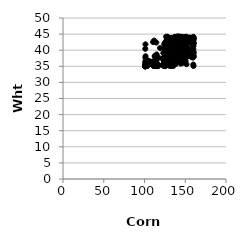
| Category | Series 0 |
|---|---|
| 136.72777560908997 | 35.765 |
| 130.25405878217626 | 36.356 |
| 138.38169360817292 | 40.525 |
| 147.95466621825304 | 41.478 |
| 157.93652203945828 | 42.384 |
| 145.1142160764156 | 37.748 |
| 102.15362811644198 | 35.946 |
| 127.79622655462948 | 42.979 |
| 159.40141447130028 | 42.681 |
| 139.8572153171643 | 42.993 |
| 140.04410825100643 | 41.652 |
| 125.28839167046857 | 40.023 |
| 154.35502141300222 | 43.609 |
| 101.50018633640991 | 35.24 |
| 126.73089541599688 | 39.45 |
| 133.78302110138736 | 38.708 |
| 100.81534180641341 | 35.036 |
| 135.9106538261241 | 42.587 |
| 144.70163184472543 | 41.023 |
| 137.67380770594968 | 42.192 |
| 125.8161522658447 | 37.862 |
| 144.47358134687306 | 42.185 |
| 101.28371883580245 | 38.121 |
| 116.55865361353845 | 35.044 |
| 150.19531930577875 | 38.073 |
| 127.9652267120658 | 42.442 |
| 132.53426273231733 | 41.588 |
| 132.25624815754523 | 36.519 |
| 147.7332097175809 | 37.868 |
| 134.77266203290574 | 40.825 |
| 130.50245933845278 | 38.812 |
| 128.92963068216812 | 36.381 |
| 128.07707935208498 | 43.072 |
| 159.48881929468297 | 37.696 |
| 101.25255429634939 | 35.365 |
| 102.60515078731365 | 35.361 |
| 152.03792089943082 | 40.462 |
| 147.36515889946048 | 41.777 |
| 132.33229366168916 | 41.93 |
| 123.28457222858277 | 35.102 |
| 160.3874768311301 | 38.092 |
| 100.71342991222684 | 35.007 |
| 137.7502930527938 | 41.564 |
| 111.45653751353935 | 35.074 |
| 133.23792423907062 | 42.244 |
| 124.28939290886308 | 41.845 |
| 150.37475608348595 | 36.664 |
| 145.82940093065787 | 38.461 |
| 134.61403264303803 | 43.092 |
| 102.78140307507637 | 35.804 |
| 147.80649185456153 | 39.119 |
| 135.07020181585025 | 43.51 |
| 134.94941046811618 | 36.562 |
| 127.94194534569507 | 42.789 |
| 105.71737378688425 | 36.649 |
| 150.35580454033305 | 43.659 |
| 151.16893175716208 | 42.697 |
| 142.37378215201423 | 43.584 |
| 149.49649763692324 | 36.777 |
| 134.2863159495147 | 42.075 |
| 139.28961793121934 | 39.021 |
| 136.24550839912322 | 38.605 |
| 133.08947951596048 | 43.722 |
| 153.78992681641517 | 40.324 |
| 160.0875590081285 | 41.274 |
| 149.54992638110843 | 38.553 |
| 148.02626354366294 | 43.538 |
| 141.4202918124553 | 40.097 |
| 151.8277004785291 | 38.894 |
| 140.81856470674865 | 38.943 |
| 130.8034514433382 | 39.058 |
| 135.4874719952224 | 42.487 |
| 133.58334572011807 | 37.039 |
| 139.24318246746913 | 38.708 |
| 142.11472846057399 | 41.66 |
| 115.02285806673206 | 35.075 |
| 127.75033827182104 | 38.354 |
| 101.16738249184034 | 41.82 |
| 124.707117973276 | 42.126 |
| 113.29790006227597 | 38.222 |
| 135.85412379999866 | 42.029 |
| 150.9299808003734 | 43.623 |
| 128.14687129542176 | 42.508 |
| 134.17156031287078 | 42.072 |
| 150.0737167668923 | 42.519 |
| 139.379389662458 | 39.047 |
| 131.414594250678 | 37.931 |
| 129.06022883741545 | 43.316 |
| 127.39636146210849 | 37.21 |
| 159.99789712811204 | 43.65 |
| 150.6932941827846 | 40.541 |
| 127.20123820496103 | 41.742 |
| 139.78921634008884 | 43.959 |
| 150.72189384811423 | 38.707 |
| 142.23229969795852 | 44.135 |
| 131.46871683967078 | 43.426 |
| 149.9092281695046 | 36.614 |
| 133.89787231306406 | 43.502 |
| 135.79133216996703 | 42.62 |
| 129.96167330858876 | 38.783 |
| 151.93471986193705 | 42.464 |
| 141.930859695245 | 41.702 |
| 140.2839199443765 | 40.041 |
| 128.24707921056554 | 37.813 |
| 140.3680052826824 | 42.674 |
| 134.0116940751758 | 37.562 |
| 154.97183677798196 | 39.298 |
| 112.21171621740429 | 35.798 |
| 131.8054861013131 | 39.649 |
| 126.56712252140473 | 42.785 |
| 138.01859751937292 | 42.994 |
| 112.67216486692249 | 35.905 |
| 137.7942676853786 | 38.16 |
| 157.35942402765727 | 42.356 |
| 137.3894701453518 | 42.595 |
| 152.8102267967633 | 40.353 |
| 147.33171712768572 | 42.019 |
| 143.32680736872595 | 43.235 |
| 116.10248756436845 | 35.688 |
| 130.66333557342492 | 39.679 |
| 130.86671252200975 | 35.113 |
| 148.7956572108479 | 42.716 |
| 136.87006422182677 | 43.985 |
| 126.37398184598732 | 38.652 |
| 153.34535442886278 | 40.757 |
| 122.58075005686965 | 35.557 |
| 141.45977721457217 | 40.558 |
| 151.50835921797002 | 35.639 |
| 125.38759487186823 | 42.42 |
| 134.8285107953695 | 38.675 |
| 100.97250844544286 | 40.442 |
| 135.55787959838037 | 42.719 |
| 137.86232958437208 | 41.733 |
| 140.3097129099747 | 38.186 |
| 100.88232252621587 | 35.415 |
| 135.4146533341257 | 42.12 |
| 137.0851027570549 | 42.51 |
| 136.47402366489746 | 38.2 |
| 126.43678034351336 | 38.424 |
| 125.04145969882599 | 38.074 |
| 111.8529160985858 | 42.994 |
| 156.868938690456 | 42.833 |
| 130.43679552684986 | 38.218 |
| 110.79877324021513 | 35.178 |
| 108.90131599607886 | 36.138 |
| 148.46403225619633 | 37.085 |
| 139.5413068646756 | 44.153 |
| 132.75611313151987 | 39.88 |
| 137.91613160185298 | 39.497 |
| 136.9105351589857 | 39.079 |
| 145.99603376527202 | 43.25 |
| 141.12416797768492 | 38.634 |
| 141.62469291677826 | 44.152 |
| 127.02813614363255 | 38.409 |
| 124.75447566850603 | 37.507 |
| 159.83999402456314 | 43.746 |
| 111.0742641589613 | 36.565 |
| 148.8388610940649 | 42.643 |
| 128.63928830668584 | 38.424 |
| 146.16825438621183 | 40.353 |
| 135.18364402585493 | 36.341 |
| 156.094541212219 | 38.347 |
| 126.30045021517984 | 40.849 |
| 134.38158437134146 | 42.196 |
| 131.73822225549904 | 43.303 |
| 149.00731558075321 | 41.311 |
| 141.58920418692512 | 36.718 |
| 129.97256776867596 | 39.079 |
| 128.37914309824305 | 44.133 |
| 132.86326003914817 | 37.553 |
| 133.03928180815888 | 41.257 |
| 141.19417621864974 | 37.619 |
| 101.09688963087078 | 35.049 |
| 101.23304910492794 | 36.402 |
| 125.67245997259612 | 37.669 |
| 132.98849149892737 | 40.156 |
| 147.02350131736472 | 36.677 |
| 160.294431387843 | 42.024 |
| 135.3559554575523 | 40.218 |
| 135.68021748421793 | 41.843 |
| 112.4044261915423 | 35.381 |
| 160.21596067294055 | 38.95 |
| 138.2928754146031 | 43.823 |
| 154.46749718603354 | 43.538 |
| 147.20070964958668 | 43.17 |
| 136.60035700497232 | 42.708 |
| 140.8759249942207 | 39.047 |
| 131.98203322935842 | 35.431 |
| 141.01433734756617 | 44.143 |
| 137.99653281654867 | 41.711 |
| 103.42895543191592 | 35.092 |
| 146.7627191126142 | 41.532 |
| 154.21183249798435 | 42.876 |
| 110.27000686381727 | 35.364 |
| 149.08899466941457 | 43.984 |
| 146.3999171335376 | 43.557 |
| 133.6647224354903 | 38.59 |
| 148.95342366598382 | 41.833 |
| 144.88548215327185 | 42.977 |
| 157.66548405801225 | 42.082 |
| 124.49398654350618 | 37.984 |
| 112.86309463005695 | 35.797 |
| 147.44872808326278 | 41.673 |
| 138.73899249562572 | 42.045 |
| 114.58257769349129 | 36.808 |
| 134.09859955995717 | 38.784 |
| 160.13963163325528 | 35.072 |
| 142.1862335375063 | 41.392 |
| 158.42673885592083 | 42.947 |
| 137.03247626093622 | 39.362 |
| 136.1035780443579 | 43.532 |
| 136.19719292959445 | 40.738 |
| 145.75130538555214 | 42.445 |
| 139.06286478962096 | 42.874 |
| 140.1264058857665 | 41.568 |
| 129.21017166938628 | 37.837 |
| 138.77742327838408 | 35.752 |
| 147.57482526168798 | 36.124 |
| 133.17118998172668 | 41.736 |
| 127.15090068320242 | 40.324 |
| 129.7193755104452 | 41.701 |
| 148.58420040496577 | 41.86 |
| 127.24715526236838 | 37.821 |
| 135.2978696790249 | 35.077 |
| 136.55806966271945 | 37.528 |
| 158.6707102916834 | 42.127 |
| 113.42867826336169 | 35.269 |
| 145.34752935412249 | 39.174 |
| 135.01697237544684 | 36.612 |
| 112.43770939449796 | 38.166 |
| 147.63390152842533 | 43.214 |
| 100.85701897183876 | 35.08 |
| 157.62704746407206 | 37.859 |
| 146.89515475073546 | 40.154 |
| 138.60256218758408 | 39.024 |
| 153.5446167841751 | 42.419 |
| 130.05717505882228 | 42.17 |
| 126.91203700697896 | 41.97 |
| 135.98024862493932 | 42.136 |
| 152.19365919999734 | 42.897 |
| 134.81476023204013 | 41.615 |
| 132.34188431840653 | 38.66 |
| 152.6626840654045 | 42.953 |
| 159.92530830187889 | 40.292 |
| 134.54301365485964 | 38.36 |
| 134.082077809114 | 37.495 |
| 159.71599020812067 | 43.398 |
| 123.60969832434148 | 35.914 |
| 128.98884012510425 | 36.164 |
| 149.69784400502795 | 43.016 |
| 154.79463217735545 | 42.974 |
| 103.2680843771554 | 35.146 |
| 160.3553300332217 | 39.42 |
| 149.7201538773316 | 43.748 |
| 133.9431551510717 | 41.592 |
| 101.01117943995023 | 35.728 |
| 160.06378296876062 | 43.054 |
| 138.67576313235907 | 44.041 |
| 128.7915219617943 | 42.882 |
| 133.36564368604246 | 42.317 |
| 130.14895084103563 | 42.071 |
| 156.58255170919267 | 42.762 |
| 160.26401144901192 | 43.577 |
| 133.31524103595729 | 38.828 |
| 150.15669983614976 | 42.736 |
| 149.2009191058485 | 38.334 |
| 139.92440923745212 | 39.785 |
| 113.93781716664786 | 35.043 |
| 133.4255824370674 | 43.832 |
| 148.39985459528256 | 39.447 |
| 137.60431241087556 | 44.149 |
| 160.17623448556606 | 38.032 |
| 159.9750919794041 | 43.501 |
| 138.9825067238705 | 36.16 |
| 159.22290626200362 | 43.784 |
| 144.34190772967105 | 40.032 |
| 136.94913296547054 | 37.785 |
| 139.36016967747173 | 39.223 |
| 152.91634086984226 | 42.582 |
| 131.10525166130418 | 37.576 |
| 127.56485513710815 | 37.125 |
| 144.1801856878928 | 43.76 |
| 147.13311797005383 | 42.043 |
| 131.14758159734495 | 42.523 |
| 151.75690443147204 | 42.18 |
| 132.4495490335008 | 36.586 |
| 126.86777122413962 | 39.144 |
| 149.96018996207633 | 42.216 |
| 138.23394134371352 | 36.629 |
| 150.8018758188574 | 44.18 |
| 134.24947947080648 | 41.789 |
| 124.87536714856515 | 38.231 |
| 148.20944251347476 | 42.957 |
| 137.21388221814288 | 38.558 |
| 100.73693036295721 | 35.01 |
| 148.27472633779053 | 42.699 |
| 136.70047056261288 | 42.144 |
| 101.06434340366756 | 35.453 |
| 152.5457922750451 | 42.283 |
| 140.21600898301512 | 38.607 |
| 156.20664098222846 | 43.399 |
| 151.34964636017918 | 42.217 |
| 123.86897125424217 | 36.31 |
| 143.5870648978903 | 43.667 |
| 125.17576805293085 | 38.368 |
| 113.83111254201302 | 35.205 |
| 140.02332988655226 | 38.959 |
| 138.5102357413005 | 42.598 |
| 138.86254292677827 | 41.979 |
| 140.62786143021623 | 44.186 |
| 124.44819533027902 | 35.087 |
| 117.29679189547072 | 37.706 |
| 152.35152572575043 | 42.158 |
| 143.77977478654202 | 41.852 |
| 114.29646071947536 | 37.083 |
| 126.6591075439756 | 39.727 |
| 128.45295837674232 | 36.367 |
| 128.48938865877474 | 37.408 |
| 135.1445005587004 | 43.795 |
| 139.15806873069482 | 43.699 |
| 132.02678331781925 | 38.372 |
| 135.52123815577002 | 35.961 |
| 137.43400110627428 | 43.05 |
| 101.19052132284996 | 35.356 |
| 126.03563815922963 | 35.906 |
| 143.0773411158818 | 39.174 |
| 131.22522857353022 | 36.209 |
| 133.48937799079633 | 40.647 |
| 129.87783323960358 | 39.424 |
| 136.7577742070779 | 42.113 |
| 159.81152018154407 | 42.17 |
| 143.98044331602094 | 44.183 |
| 146.46990313666984 | 44.14 |
| 101.83631511536898 | 35.422 |
| 125.73057338774102 | 35.051 |
| 136.84744792673908 | 44.118 |
| 146.2005655920826 | 41.313 |
| 140.56358122924462 | 42.243 |
| 139.1124788607028 | 44.13 |
| 129.26958933747568 | 35.966 |
| 153.71010860309815 | 38.111 |
| 136.30872667465738 | 38.107 |
| 114.21022131244807 | 36.281 |
| 129.48868986085643 | 38.324 |
| 153.16906717415256 | 43.817 |
| 127.52678428421444 | 40.05 |
| 131.52990777960198 | 37.999 |
| 136.0078097003316 | 41.752 |
| 151.06465722807295 | 44.127 |
| 139.61922170932962 | 43.362 |
| 113.11801743403235 | 38.152 |
| 135.30666646687928 | 37.977 |
| 141.79412805173158 | 44.176 |
| 136.08092833008712 | 39.545 |
| 101.03790067491063 | 35.58 |
| 102.38466102688936 | 36.326 |
| 130.32294485951536 | 42.536 |
| 153.10840764897677 | 43.167 |
| 132.6630321246238 | 35.089 |
| 129.4390789791839 | 38.977 |
| 134.69609108829522 | 43.255 |
| 158.97487652057256 | 42.844 |
| 138.88716271640212 | 42.577 |
| 110.49781557713412 | 42.54 |
| 132.11784662995234 | 39.073 |
| 138.11865525672397 | 41.669 |
| 126.79184828398917 | 35.496 |
| 141.36227637605808 | 36.844 |
| 151.60668448946896 | 44.12 |
| 123.0478969138059 | 39.147 |
| 151.43767529204212 | 43.478 |
| 160.1274804412937 | 42.301 |
| 101.14066004718737 | 37.623 |
| 130.558560703027 | 38.011 |
| 111.75009983609777 | 35.873 |
| 127.6553528059353 | 36.563 |
| 142.83815957889735 | 38.874 |
| 159.8926401860598 | 43.286 |
| 129.81055693265947 | 36.569 |
| 144.61736422670856 | 35.816 |
| 152.41068053998092 | 42.837 |
| 137.3450473137796 | 40.428 |
| 123.74965836715417 | 35.404 |
| 128.1252775039633 | 36.166 |
| 140.76737182388325 | 44.196 |
| 149.45412463476328 | 43.959 |
| 125.96489801749703 | 42.156 |
| 143.63768613527307 | 42.997 |
| 152.1082982319243 | 38.378 |
| 148.49891155057233 | 43.215 |
| 129.13758940495424 | 42.185 |
| 135.19932822942994 | 39.463 |
| 125.58290591232883 | 39.361 |
| 155.43080886401444 | 42.541 |
| 133.69179690645248 | 39.337 |
| 113.5792879852127 | 35.54 |
| 134.91436318574904 | 39.456 |
| 137.5528713065134 | 42.059 |
| 146.64754356722912 | 36.316 |
| 101.9952103093856 | 37.055 |
| 134.38937838528696 | 38.082 |
| 139.7773371848331 | 39.672 |
| 129.56702179804225 | 42.291 |
| 149.78986294760503 | 43.482 |
| 136.39689771061623 | 39.738 |
| 122.07353989617997 | 37.325 |
| 100.94211543756494 | 36.416 |
| 137.63158185484124 | 42.092 |
| 130.72150563633585 | 42.223 |
| 159.87242434392508 | 35.553 |
| 137.11220803273508 | 37.943 |
| 145.482596094892 | 42.73 |
| 137.28496583837378 | 39.561 |
| 136.6488726123536 | 39.154 |
| 128.5741190610155 | 42.504 |
| 128.30028892849225 | 44.175 |
| 115.70891652857588 | 35.584 |
| 114.53397434498926 | 42.376 |
| 138.93943357465594 | 42.246 |
| 160.32928379774145 | 42.254 |
| 133.80058853291237 | 38.863 |
| 117.17963497824259 | 35.254 |
| 148.06530818110144 | 38.352 |
| 126.2324344924276 | 38.224 |
| 154.01199085857755 | 39.095 |
| 101.31805396723392 | 35.041 |
| 141.06791477989026 | 42.822 |
| 115.52100219193561 | 35.548 |
| 151.25130404958747 | 41.948 |
| 136.34025150856078 | 39.631 |
| 150.55080738457627 | 38.501 |
| 126.15224053800428 | 37.339 |
| 128.83054213236673 | 42.419 |
| 132.61358007851715 | 37.619 |
| 114.84697278054239 | 38.694 |
| 125.06645790639496 | 36.441 |
| 137.8526606291521 | 43.206 |
| 126.10242373130642 | 41.891 |
| 128.698756233966 | 35.911 |
| 126.4979382530174 | 44.188 |
| 141.84633498413555 | 37.28 |
| 150.47469484028622 | 41.014 |
| 127.3156432119271 | 43.293 |
| 139.51120896999066 | 44.165 |
| 115.38375709628504 | 35.556 |
| 125.4707841192663 | 41.242 |
| 142.4477609345835 | 44.189 |
| 100.76576938353622 | 35.004 |
| 131.3138653032593 | 42.709 |
| 132.81667871782923 | 39.801 |
| 138.43226628824456 | 41.981 |
| 138.19662126299178 | 38.159 |
| 136.14476078541378 | 36.443 |
| 127.04176391942148 | 35.402 |
| 138.08551082967142 | 42.368 |
| 149.36546268372177 | 39.976 |
| 131.92088498905812 | 42.639 |
| 146.58171729371938 | 41.69 |
| 139.66697808205436 | 42.213 |
| 135.83908003426004 | 42.595 |
| 160.24504370517286 | 43.919 |
| 135.70914424423555 | 42.436 |
| 124.11918701144303 | 40.363 |
| 134.5661114853897 | 38.335 |
| 100.91768116323352 | 35.015 |
| 155.8348397233449 | 43.002 |
| 145.6682023508074 | 44.134 |
| 137.15924870536932 | 39.788 |
| 138.32833107896005 | 43.502 |
| 127.88236284375189 | 37.271 |
| 129.633268498151 | 38.052 |
| 100.84414227770547 | 35.018 |
| 148.65803757647012 | 41.933 |
| 158.32970141617696 | 43.873 |
| 138.48851409217562 | 38.085 |
| 140.45641531097124 | 39.507 |
| 119.11039615364079 | 40.68 |
| 143.03981879387817 | 43.708 |
| 131.02421010083376 | 39.562 |
| 142.5859457879578 | 37.428 |
| 143.3152695363321 | 36.676 |
| 139.4266760381596 | 42.449 |
| 160.02809902165194 | 44.164 |
| 134.47057587002865 | 38.997 |
| 142.6895689858376 | 44.125 |
| 145.1499155865138 | 44.031 |
| 129.35183516761674 | 42.28 |
| 131.67971874711264 | 41.828 |
| 109.72165386961643 | 36.447 |
| 136.43951747135586 | 41.83 |
| 137.4669214688315 | 42.032 |
| 135.61884822301556 | 42.318 |
| 137.25514429019256 | 41.863 |
| 127.43120271607164 | 37.44 |
| 138.63856065443323 | 42.46 |
| 140.71109649396126 | 39.634 |
| 103.68948580708897 | 35.3 |
| 149.243616220685 | 40.354 |
| 155.2908947941982 | 43.954 |
| 104.24409753544015 | 35.787 |